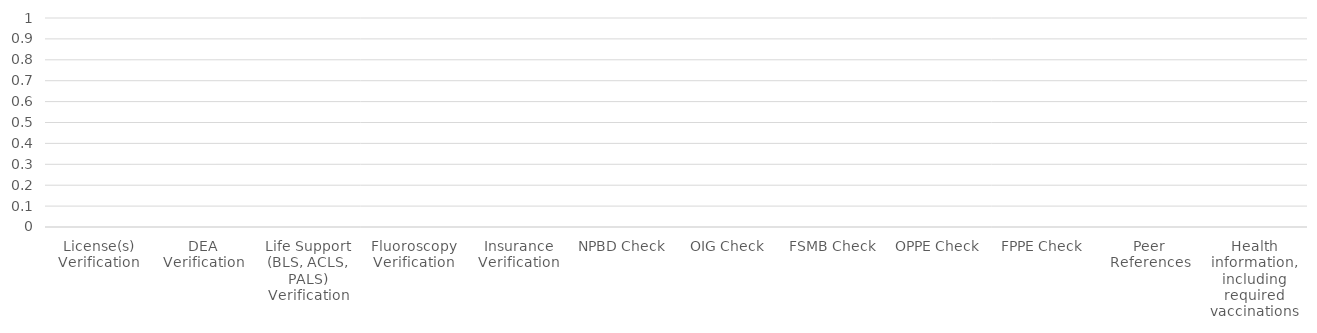
| Category | Series 0 | Series 10 |
|---|---|---|
| License(s) Verification | 0 | 0 |
| DEA Verification | 0 | 0 |
| Life Support (BLS, ACLS, PALS) Verification | 0 | 0 |
| Fluoroscopy Verification | 0 | 0 |
| Insurance Verification | 0 | 0 |
| NPBD Check | 0 | 0 |
| OIG Check | 0 | 0 |
| FSMB Check | 0 | 0 |
| OPPE Check | 0 | 0 |
| FPPE Check | 0 | 0 |
| Peer References | 0 | 0 |
| Health information, including required vaccinations | 0 | 0 |